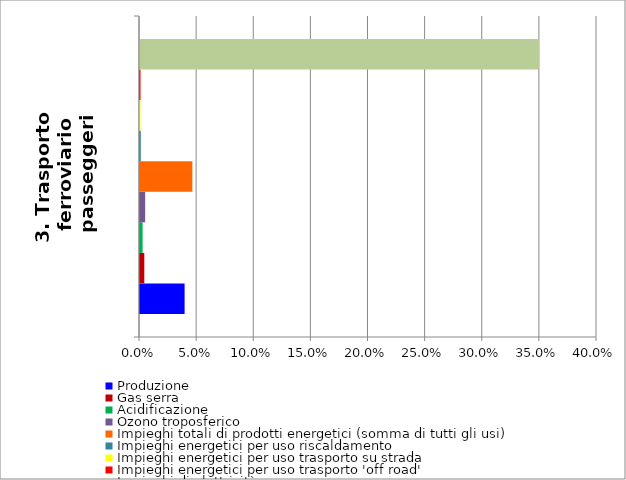
| Category | Produzione | Gas serra | Acidificazione | Ozono troposferico | Impieghi totali di prodotti energetici (somma di tutti gli usi) | Impieghi energetici per uso riscaldamento | Impieghi energetici per uso trasporto su strada | Impieghi energetici per uso trasporto 'off road' | Impieghi di elettricità |
|---|---|---|---|---|---|---|---|---|---|
| 3. Trasporto  ferroviario passeggeri | 0.039 | 0.004 | 0.002 | 0.005 | 0.046 | 0.001 | 0 | 0 | 0.349 |